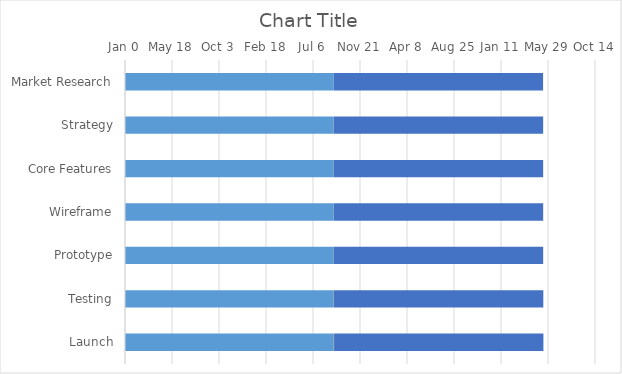
| Category | Series 0 | Duration | Progress | Remaining | Today's Date | Today's Date (Helper) |
|---|---|---|---|---|---|---|
| Market Research | 2021-08-01 | 3 | 3 | 0 | 2021-12-11 | 0.1 |
| Strategy | 2021-08-02 | 9 | 4.95 | 4.05 | 2021-12-11 | 0.1 |
| Core Features | 2021-08-07 | 6 | 1.5 | 4.5 | 2021-12-11 | 0.1 |
| Wireframe | 2021-08-10 | 7 | 0.7 | 6.3 | 2021-12-11 | 0.1 |
| Prototype | 2021-08-12 | 6 | 3 | 3 | 2021-12-11 | 0.1 |
| Testing | 2021-08-20 | 17 | 2.55 | 14.45 | 2021-12-11 | 0.1 |
| Launch | 2021-08-21 | 26 | 2.6 | 23.4 | 2021-12-11 | 0.1 |